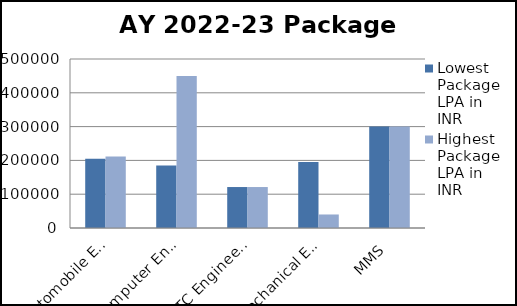
| Category | Lowest Package LPA in INR  | Highest Package LPA in INR  |
|---|---|---|
| Automobile Engineering | 205000 | 211860 |
| Computer Engineering | 185000 | 450000 |
| ExTC Engineering | 121200 | 121200 |
| Mechanical Engineering | 195000 | 40000 |
| MMS | 300000 | 300000 |